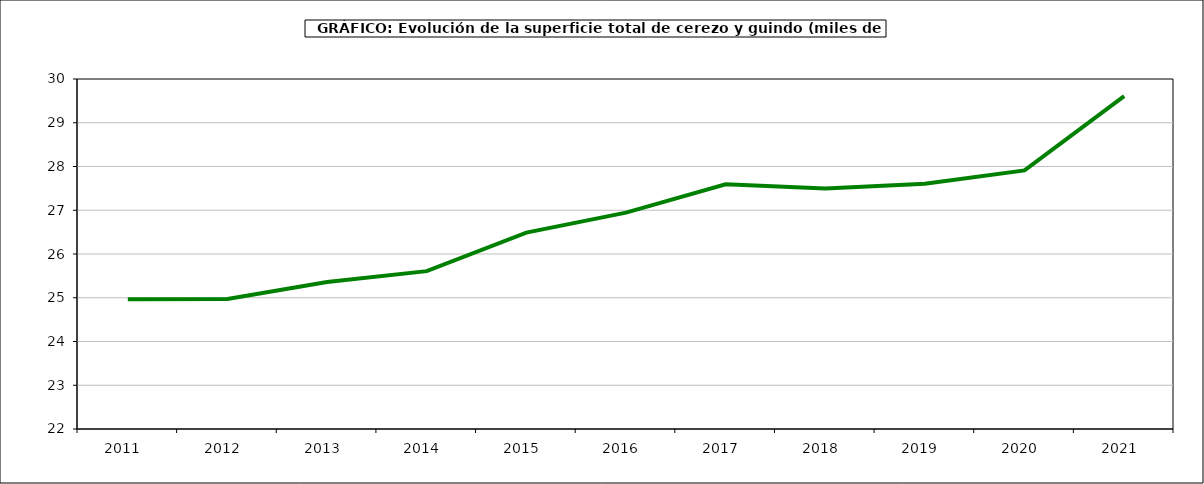
| Category | superficie cerezo y guindo |
|---|---|
| 2011.0 | 24.967 |
| 2012.0 | 24.972 |
| 2013.0 | 25.358 |
| 2014.0 | 25.608 |
| 2015.0 | 26.49 |
| 2016.0 | 26.946 |
| 2017.0 | 27.592 |
| 2018.0 | 27.5 |
| 2019.0 | 27.604 |
| 2020.0 | 27.911 |
| 2021.0 | 29.608 |